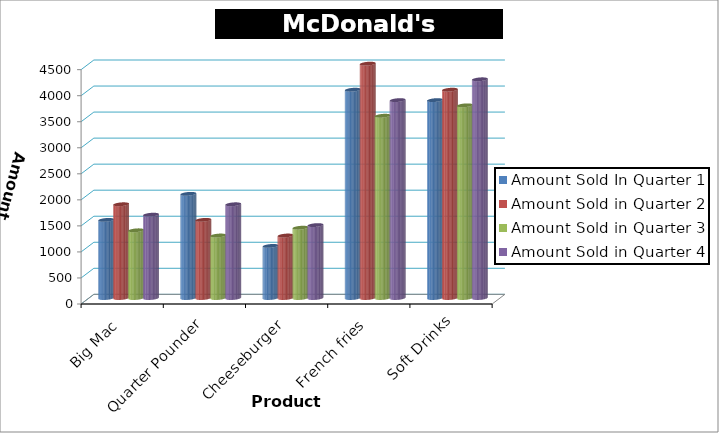
| Category | Amount Sold In Quarter 1 | Amount Sold in Quarter 2 | Amount Sold in Quarter 3 | Amount Sold in Quarter 4 |
|---|---|---|---|---|
| Big Mac | 1500 | 1800 | 1300 | 1600 |
| Quarter Pounder | 2000 | 1500 | 1200 | 1800 |
| Cheeseburger | 1000 | 1200 | 1350 | 1400 |
| French fries | 4000 | 4500 | 3500 | 3800 |
| Soft Drinks | 3800 | 4000 | 3700 | 4200 |